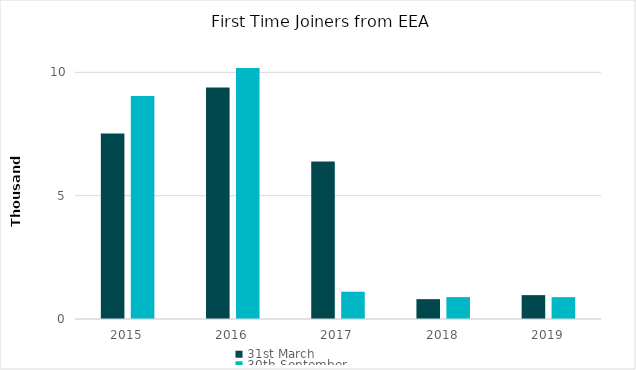
| Category | 31st March | 30th September |
|---|---|---|
| 2015.0 | 7518 | 9038 |
| 2016.0 | 9389 | 10178 |
| 2017.0 | 6382 | 1107 |
| 2018.0 | 805 | 888 |
| 2019.0 | 968 | 885 |